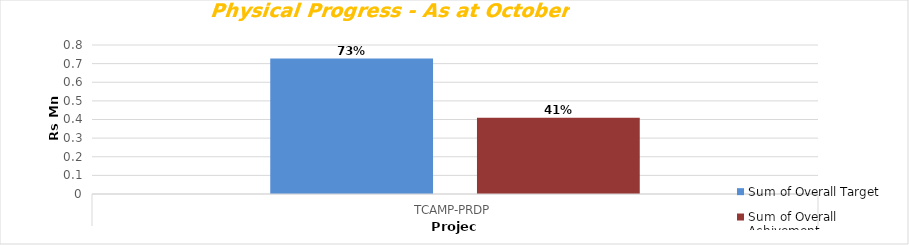
| Category | Sum of Overall Target | Sum of Overall Achivement |
|---|---|---|
| TCAMP-PRDP
 | 0.727 | 0.41 |